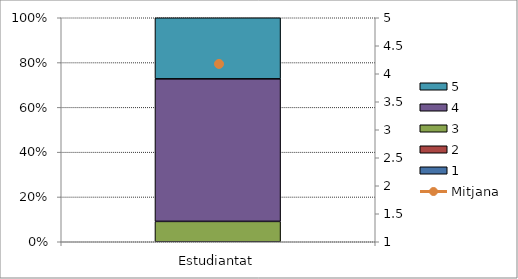
| Category | 1 | 2 | 3 | 4 | 5 |
|---|---|---|---|---|---|
| Estudiantat | 0 | 0 | 1 | 7 | 3 |